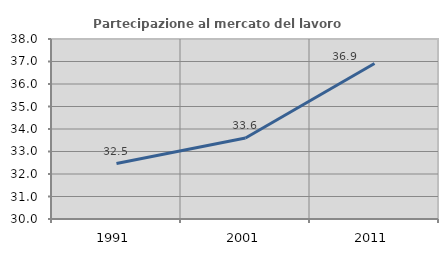
| Category | Partecipazione al mercato del lavoro  femminile |
|---|---|
| 1991.0 | 32.464 |
| 2001.0 | 33.602 |
| 2011.0 | 36.914 |